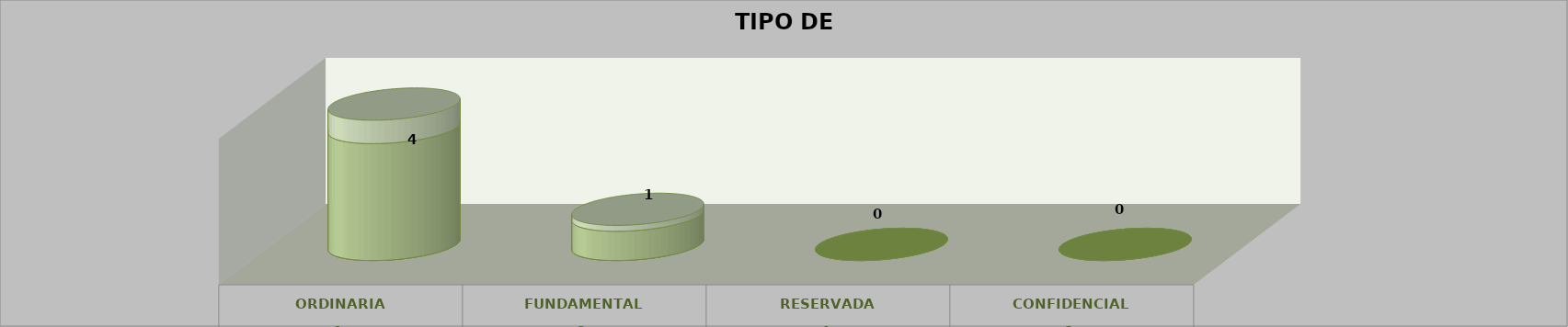
| Category | Series 0 | Series 2 | Series 1 | Series 3 | Series 4 |
|---|---|---|---|---|---|
| 0 |  |  |  | 4 | 0.8 |
| 1 |  |  |  | 1 | 0.2 |
| 2 |  |  |  | 0 | 0 |
| 3 |  |  |  | 0 | 0 |